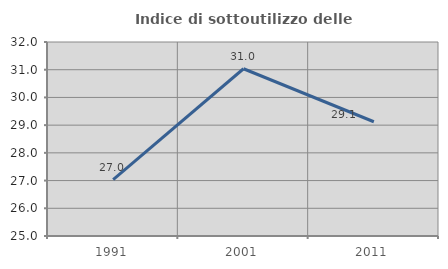
| Category | Indice di sottoutilizzo delle abitazioni  |
|---|---|
| 1991.0 | 27.036 |
| 2001.0 | 31.034 |
| 2011.0 | 29.123 |